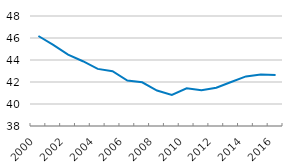
| Category | Population weighted coefficient of variation |
|---|---|
| 2000.0 | 46.183 |
| 2001.0 | 45.381 |
| 2002.0 | 44.488 |
| 2003.0 | 43.889 |
| 2004.0 | 43.192 |
| 2005.0 | 42.984 |
| 2006.0 | 42.131 |
| 2007.0 | 41.969 |
| 2008.0 | 41.223 |
| 2009.0 | 40.832 |
| 2010.0 | 41.429 |
| 2011.0 | 41.246 |
| 2012.0 | 41.481 |
| 2013.0 | 42.001 |
| 2014.0 | 42.506 |
| 2015.0 | 42.687 |
| 2016.0 | 42.641 |